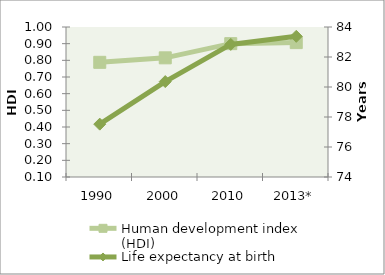
| Category | Human development index (HDI) |
|---|---|
| 1990 | 0.788 |
| 2000 | 0.815 |
| 2010 | 0.9 |
| 2013* | 0.906 |